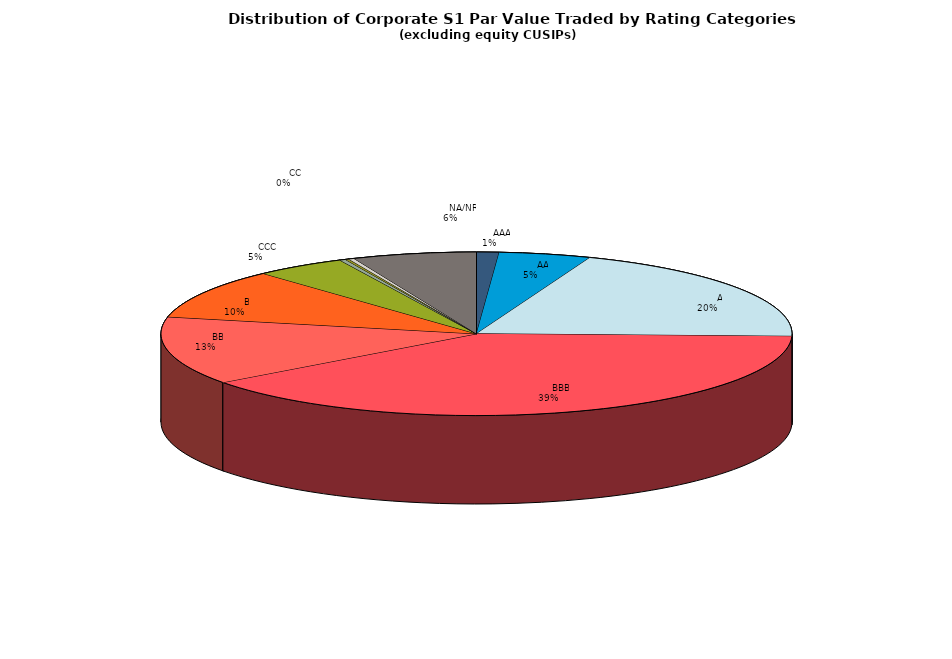
| Category | Series 0 |
|---|---|
|         AAA | 362813864.791 |
|         AA | 1486225215.062 |
|         A | 6189577145.803 |
|         BBB | 12411244221.016 |
|         BB | 4243277981.192 |
|         B | 3112513209.431 |
|         CCC | 1472501816.022 |
|         CC | 98572741.127 |
|         C | 57845479.406 |
|         D | 92312460.183 |
|         NA/NR | 2001854943.66 |